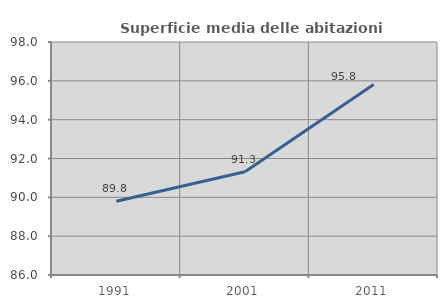
| Category | Superficie media delle abitazioni occupate |
|---|---|
| 1991.0 | 89.797 |
| 2001.0 | 91.316 |
| 2011.0 | 95.809 |